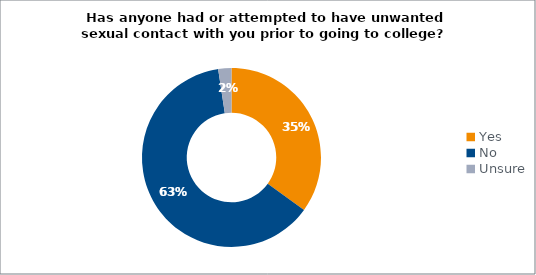
| Category | Series 0 |
|---|---|
| Yes | 0.35 |
| No | 0.626 |
| Unsure | 0.024 |